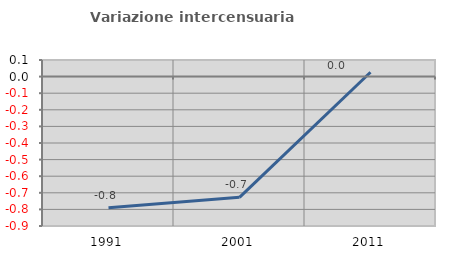
| Category | Variazione intercensuaria annua |
|---|---|
| 1991.0 | -0.79 |
| 2001.0 | -0.727 |
| 2011.0 | 0.026 |